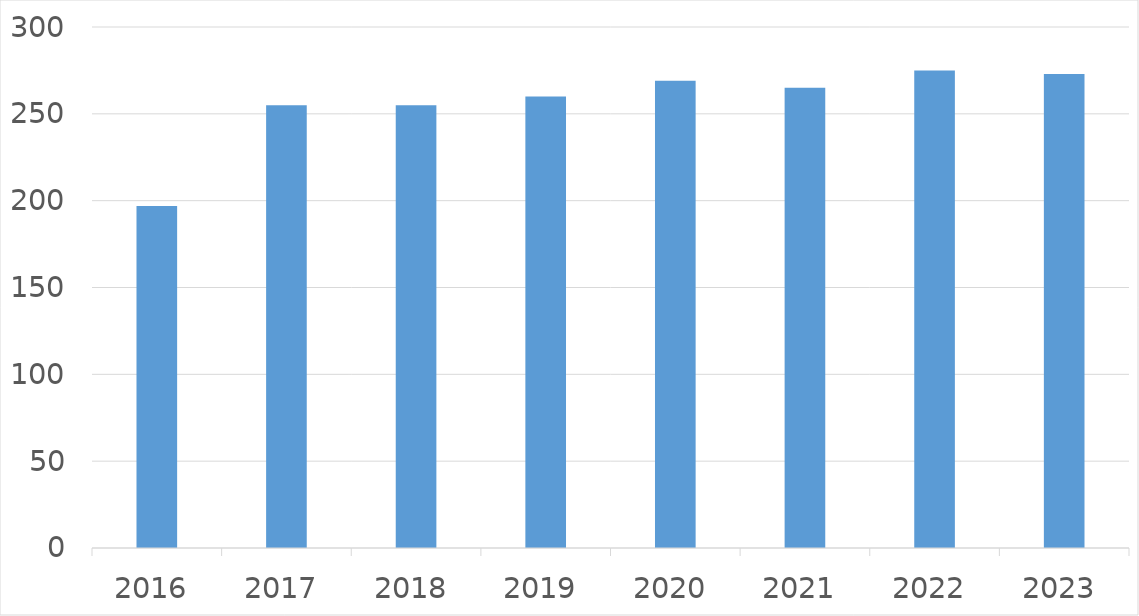
| Category | Series 0 |
|---|---|
| 2016 | 197 |
| 2017 | 255 |
| 2018 | 255 |
| 2019 | 260 |
| 2020 | 269 |
| 2021 | 265 |
| 2022 | 275 |
| 2023 | 273 |